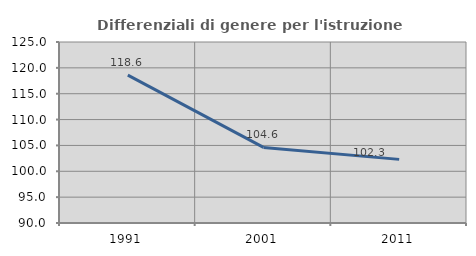
| Category | Differenziali di genere per l'istruzione superiore |
|---|---|
| 1991.0 | 118.585 |
| 2001.0 | 104.621 |
| 2011.0 | 102.303 |